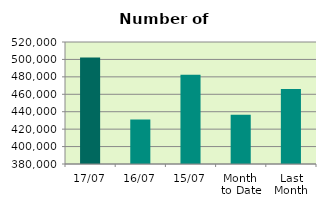
| Category | Series 0 |
|---|---|
| 17/07 | 502276 |
| 16/07 | 430970 |
| 15/07 | 482276 |
| Month 
to Date | 436428 |
| Last
Month | 466167.6 |